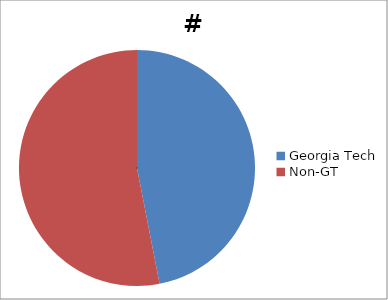
| Category | # Students |
|---|---|
| Georgia Tech | 673 |
| Non-GT | 761 |